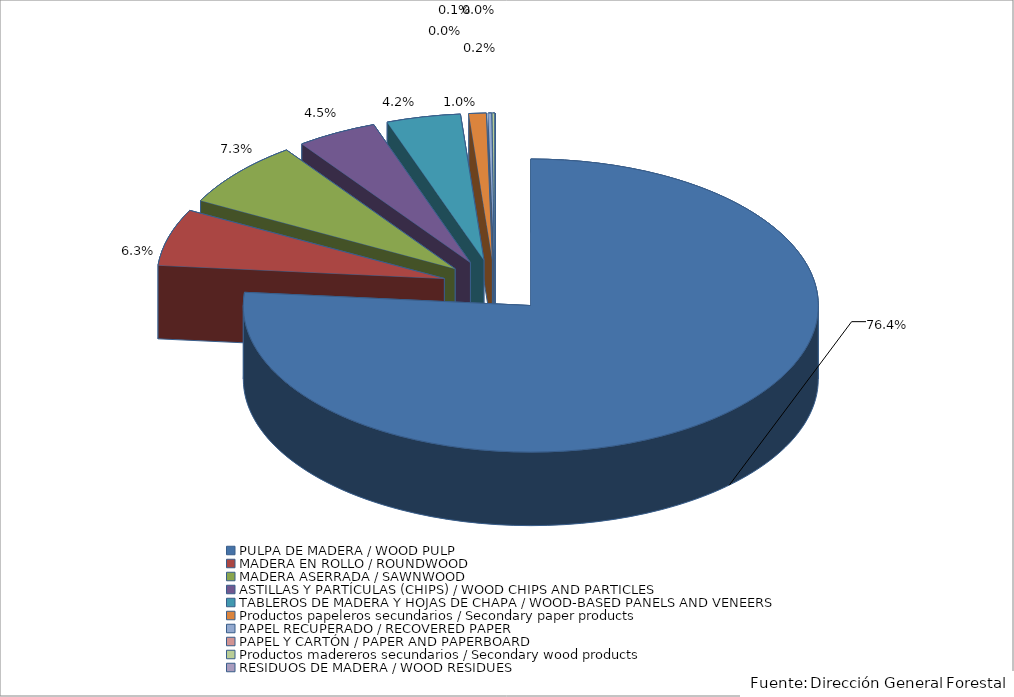
| Category | Series 0 |
|---|---|
| PULPA DE MADERA / WOOD PULP | 76.44 |
| MADERA EN ROLLO / ROUNDWOOD | 6.254 |
| MADERA ASERRADA / SAWNWOOD | 7.332 |
| ASTILLAS Y PARTÍCULAS (CHIPS) / WOOD CHIPS AND PARTICLES | 4.512 |
| TABLEROS DE MADERA Y HOJAS DE CHAPA / WOOD-BASED PANELS AND VENEERS | 4.159 |
| Productos papeleros secundarios / Secondary paper products | 0.97 |
| PAPEL RECUPERADO / RECOVERED PAPER | 0.193 |
| PAPEL Y CARTÓN / PAPER AND PAPERBOARD | 0.01 |
| Productos madereros secundarios / Secondary wood products | 0.131 |
| RESIDUOS DE MADERA / WOOD RESIDUES | 0 |